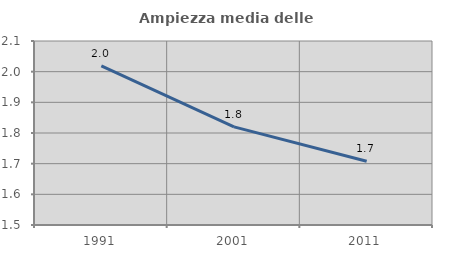
| Category | Ampiezza media delle famiglie |
|---|---|
| 1991.0 | 2.019 |
| 2001.0 | 1.82 |
| 2011.0 | 1.708 |